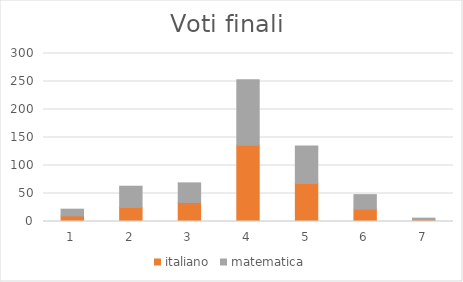
| Category | italiano | matematica |
|---|---|---|
| 0 | 10 | 12 |
| 1 | 25 | 38 |
| 2 | 34 | 35 |
| 3 | 136 | 117 |
| 4 | 68 | 67 |
| 5 | 22 | 26 |
| 6 | 3 | 3 |